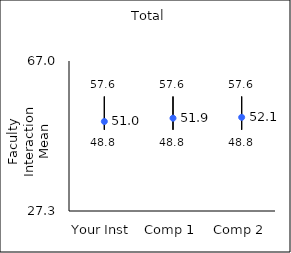
| Category | 25th percentile | 75th percentile | Mean |
|---|---|---|---|
| Your Inst | 48.8 | 57.6 | 50.99 |
| Comp 1 | 48.8 | 57.6 | 51.87 |
| Comp 2 | 48.8 | 57.6 | 52.09 |